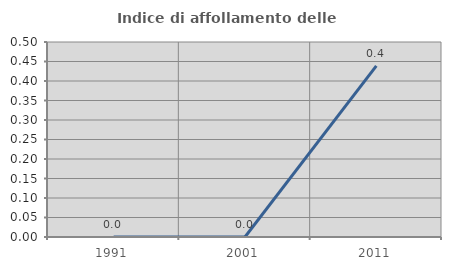
| Category | Indice di affollamento delle abitazioni  |
|---|---|
| 1991.0 | 0 |
| 2001.0 | 0 |
| 2011.0 | 0.439 |